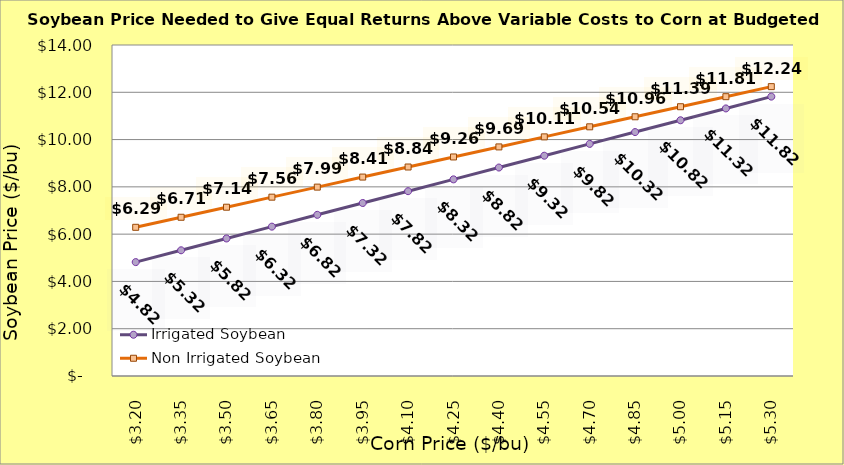
| Category | Irrigated Soybean | Non Irrigated Soybean |
|---|---|---|
| 3.2 | 4.817 | 6.289 |
| 3.35 | 5.317 | 6.714 |
| 3.5 | 5.817 | 7.139 |
| 3.65 | 6.317 | 7.564 |
| 3.8 | 6.817 | 7.989 |
| 3.9499999999999997 | 7.317 | 8.414 |
| 4.1 | 7.817 | 8.839 |
| 4.25 | 8.317 | 9.264 |
| 4.4 | 8.817 | 9.689 |
| 4.550000000000001 | 9.317 | 10.114 |
| 4.700000000000001 | 9.817 | 10.539 |
| 4.850000000000001 | 10.317 | 10.964 |
| 5.000000000000002 | 10.817 | 11.389 |
| 5.150000000000002 | 11.317 | 11.814 |
| 5.3000000000000025 | 11.817 | 12.239 |